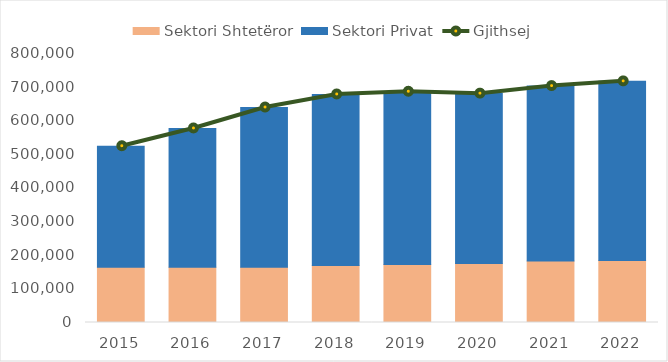
| Category | Sektori Shtetëror | Sektori Privat |
|---|---|---|
| 2015.0 | 164020 | 360230 |
| 2016.0 | 164635 | 412473 |
| 2017.0 | 164339 | 475019 |
| 2018.0 | 169865 | 508296 |
| 2019.0 | 172745 | 513508 |
| 2020.0 | 175443 | 505228 |
| 2021.0 | 183255 | 519867 |
| 2022.0 | 184114 | 533013 |